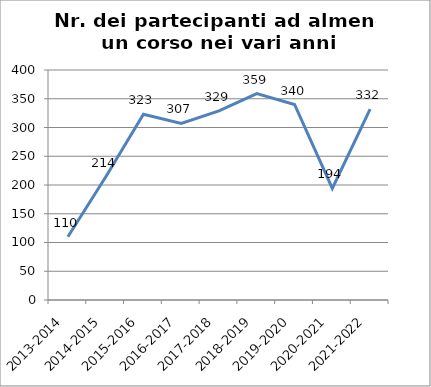
| Category | Nr. Partecipanti ad almeno un Corso |
|---|---|
| 2013-2014 | 110 |
| 2014-2015 | 214 |
| 2015-2016 | 323 |
| 2016-2017 | 307 |
| 2017-2018 | 329 |
| 2018-2019 | 359 |
| 2019-2020 | 340 |
| 2020-2021 | 194 |
| 2021-2022 | 332 |